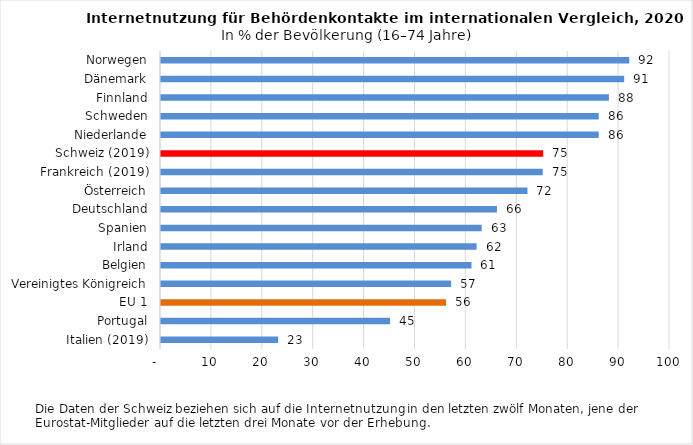
| Category | 2020 |
|---|---|
| Italien (2019) | 23 |
| Portugal | 45 |
| EU 1 | 56 |
| Vereinigtes Königreich | 57 |
| Belgien | 61 |
| Irland | 62 |
| Spanien | 63 |
| Deutschland | 66 |
| Österreich | 72 |
| Frankreich (2019) | 75 |
| Schweiz (2019) | 75.093 |
| Niederlande | 86 |
| Schweden | 86 |
| Finnland | 88 |
| Dänemark | 91 |
| Norwegen | 92 |